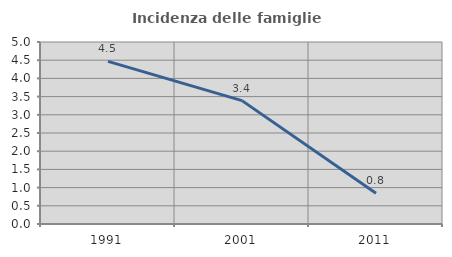
| Category | Incidenza delle famiglie numerose |
|---|---|
| 1991.0 | 4.467 |
| 2001.0 | 3.39 |
| 2011.0 | 0.847 |